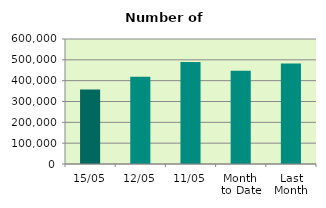
| Category | Series 0 |
|---|---|
| 15/05 | 357022 |
| 12/05 | 418218 |
| 11/05 | 489486 |
| Month 
to Date | 447250.6 |
| Last
Month | 481931.444 |